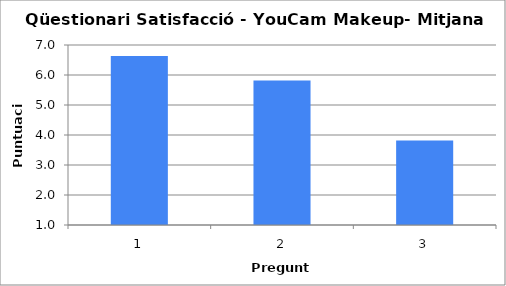
| Category | Series 0 |
|---|---|
| 0 | 6.636 |
| 1 | 5.818 |
| 2 | 3.818 |